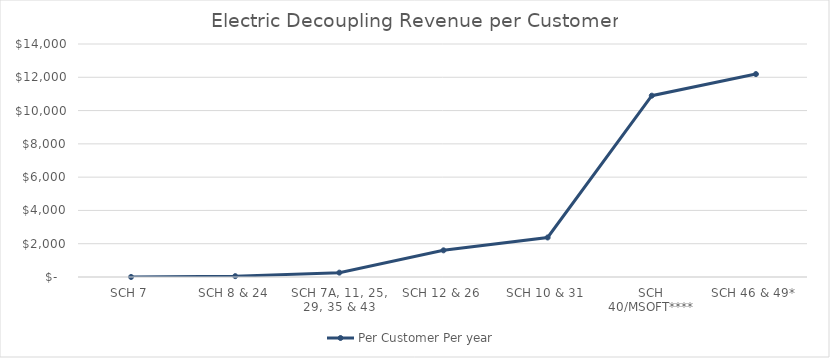
| Category | Per Customer Per year  |
|---|---|
| SCH 7 | 1.155 |
| SCH 8 & 24 | 50.713 |
| SCH 7A, 11, 25, 29, 35 & 43 | 262.25 |
| SCH 12 & 26 | 1602.136 |
| SCH 10 & 31 | 2373.988 |
| SCH 40/MSOFT**** | 10895.203 |
| SCH 46 & 49* | 12192.495 |